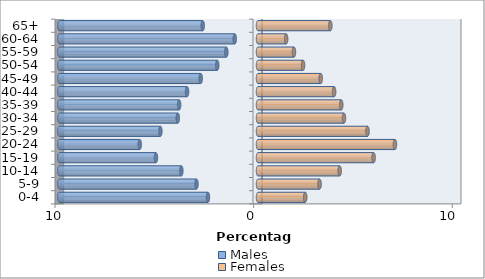
| Category | Males | Females |
|---|---|---|
| 0-4 | -2.518 | 2.377 |
| 5-9 | -3.097 | 3.1 |
| 10-14 | -3.859 | 4.111 |
| 15-19 | -5.138 | 5.82 |
| 20-24 | -5.952 | 6.894 |
| 25-29 | -4.914 | 5.512 |
| 30-34 | -4.037 | 4.328 |
| 35-39 | -3.97 | 4.191 |
| 40-44 | -3.571 | 3.833 |
| 45-49 | -2.884 | 3.158 |
| 50-54 | -2.052 | 2.268 |
| 55-59 | -1.596 | 1.809 |
| 60-64 | -1.17 | 1.418 |
| 65+ | -2.783 | 3.641 |